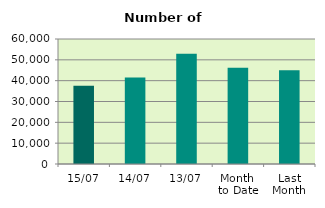
| Category | Series 0 |
|---|---|
| 15/07 | 37618 |
| 14/07 | 41504 |
| 13/07 | 52966 |
| Month 
to Date | 46192 |
| Last
Month | 45009.909 |